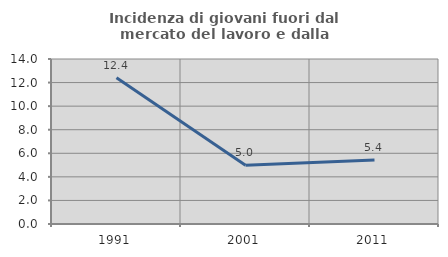
| Category | Incidenza di giovani fuori dal mercato del lavoro e dalla formazione  |
|---|---|
| 1991.0 | 12.412 |
| 2001.0 | 4.991 |
| 2011.0 | 5.439 |